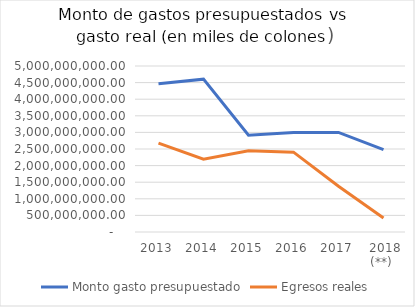
| Category | Monto gasto presupuestado | Egresos reales |
|---|---|---|
| 2013 | 4468011359.7 | 2676597452.05 |
| 2014 | 4603298295.1 | 2195123335.72 |
| 2015 | 2915752950 | 2445116980.93 |
| 2016 | 2997679154 | 2405790976.94 |
| 2017 | 3000000000 | 1376009781.59 |
|  2018 (**)  | 2480000000 | 421435443.34 |